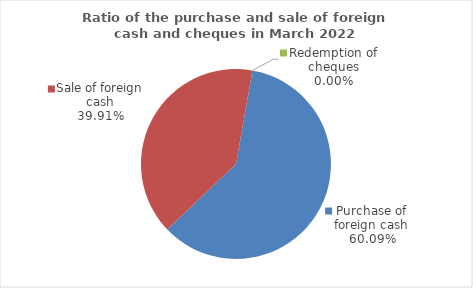
| Category | Series 0 |
|---|---|
| Purchase of foreign cash | 60.09 |
| Sale of foreign cash | 39.91 |
| Redemption of cheques | 0 |